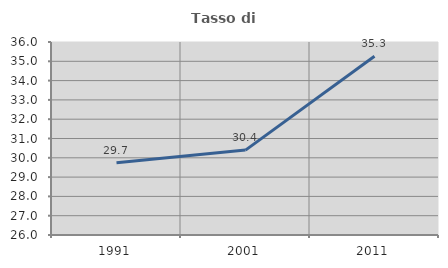
| Category | Tasso di occupazione   |
|---|---|
| 1991.0 | 29.739 |
| 2001.0 | 30.398 |
| 2011.0 | 35.264 |